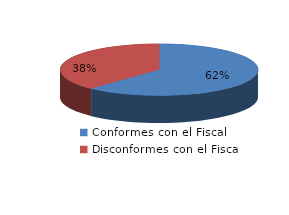
| Category | Series 0 |
|---|---|
| 0 | 6146 |
| 1 | 3780 |